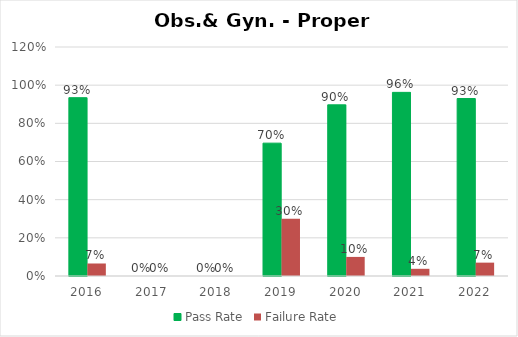
| Category | Pass Rate | Failure Rate |
|---|---|---|
| 2016.0 | 0.934 | 0.066 |
| 2017.0 | 0 | 0 |
| 2018.0 | 0 | 0 |
| 2019.0 | 0.696 | 0.3 |
| 2020.0 | 0.897 | 0.1 |
| 2021.0 | 0.962 | 0.038 |
| 2022.0 | 0.93 | 0.07 |